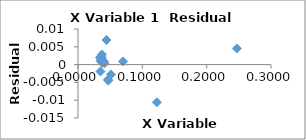
| Category | Series 0 |
|---|---|
| 0.2469135802469136 | 0.005 |
| 0.12269938650306748 | -0.011 |
| 0.06993006993006992 | 0.001 |
| 0.04424778761061947 | 0.007 |
| 0.05115089514066496 | -0.003 |
| 0.040160642570281124 | 0.001 |
| 0.03717472118959108 | 0.003 |
| 0.04106776180698152 | 0 |
| 0.046620046620046623 | -0.004 |
| 0.047058823529411764 | -0.005 |
| 0.03690036900369004 | 0.002 |
| 0.03780718336483932 | 0 |
| 0.03717472118959108 | 0.001 |
| 0.03571428571428571 | 0.001 |
| 0.034013605442176874 | 0.002 |
| 0.03552397868561279 | 0.001 |
| 0.034904013961605584 | -0.002 |